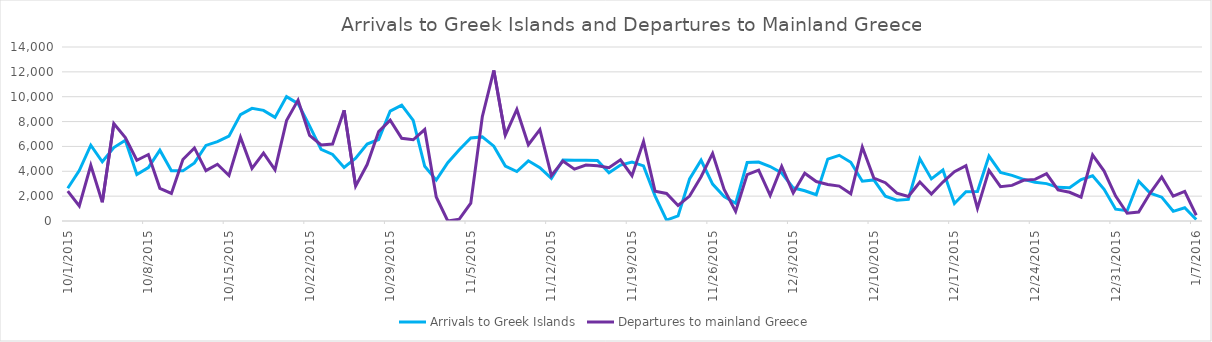
| Category | Arrivals to Greek Islands | Departures to mainland Greece |
|---|---|---|
| 10/1/15 | 2631 | 2409 |
| 10/2/15 | 4055 | 1215 |
| 10/3/15 | 6097 | 4480 |
| 10/4/15 | 4763 | 1513 |
| 10/5/15 | 5909 | 7833 |
| 10/6/15 | 6496 | 6707 |
| 10/7/15 | 3734 | 4886 |
| 10/8/15 | 4295 | 5349 |
| 10/9/15 | 5695 | 2631 |
| 10/10/15 | 4045 | 2214 |
| 10/11/15 | 4034 | 4950 |
| 10/12/15 | 4671 | 5879 |
| 10/13/15 | 6079 | 4052 |
| 10/14/15 | 6380 | 4564 |
| 10/15/15 | 6830 | 3660 |
| 10/16/15 | 8564 | 6743 |
| 10/17/15 | 9063 | 4239 |
| 10/18/15 | 8900 | 5457 |
| 10/19/15 | 8337 | 4119 |
| 10/20/15 | 10006 | 8083 |
| 10/21/15 | 9444 | 9725 |
| 10/22/15 | 7651 | 6896 |
| 10/23/15 | 5762 | 6120 |
| 10/24/15 | 5354 | 6195 |
| 10/25/15 | 4311 | 8916 |
| 10/26/15 | 5049 | 2804 |
| 10/27/15 | 6195 | 4540 |
| 10/28/15 | 6557 | 7191 |
| 10/29/15 | 8847 | 8117 |
| 10/30/15 | 9323 | 6649 |
| 10/31/15 | 8089 | 6537 |
| 11/1/15 | 4400 | 7360 |
| 11/2/15 | 3290 | 1935 |
| 11/3/15 | 4689 | 0 |
| 11/4/15 | 5740 | 142 |
| 11/5/15 | 6679 | 1430 |
| 11/6/15 | 6765 | 8392 |
| 11/7/15 | 6022 | 12116 |
| 11/8/15 | 4425 | 6902 |
| 11/9/15 | 3979 | 8977 |
| 11/10/15 | 4842 | 6133 |
| 11/11/15 | 4296 | 7354 |
| 11/12/15 | 3425 | 3650 |
| 11/13/15 | 4909 | 4820 |
| 11/14/15 | 4884 | 4171 |
| 11/15/15 | 4891 | 4497 |
| 11/16/15 | 4873 | 4442 |
| 11/17/15 | 3873 | 4289 |
| 11/18/15 | 4499 | 4927 |
| 11/19/15 | 4737 | 3644 |
| 11/20/15 | 4432 | 6389 |
| 11/21/15 | 2020 | 2401 |
| 11/22/15 | 76 | 2214 |
| 11/23/15 | 409 | 1245 |
| 11/24/15 | 3383 | 2006 |
| 11/25/15 | 4889 | 3565 |
| 11/26/15 | 2973 | 5435 |
| 11/27/15 | 1961 | 2532 |
| 11/28/15 | 1420 | 778 |
| 11/29/15 | 4703 | 3736 |
| 11/30/15 | 4744 | 4090 |
| 12/1/15 | 4386 | 2057 |
| 12/2/15 | 3863 | 4384 |
| 12/3/15 | 2671 | 2255 |
| 12/4/15 | 2435 | 3844 |
| 12/5/15 | 2110 | 3172 |
| 12/6/15 | 4978 | 2943 |
| 12/7/15 | 5287 | 2810 |
| 12/8/15 | 4721 | 2189 |
| 12/9/15 | 3203 | 5947 |
| 12/10/15 | 3308 | 3456 |
| 12/11/15 | 1999 | 3079 |
| 12/12/15 | 1671 | 2235 |
| 12/13/15 | 1738 | 1976 |
| 12/14/15 | 5005 | 3138 |
| 12/15/15 | 3389 | 2173 |
| 12/16/15 | 4098 | 3137 |
| 12/17/15 | 1402 | 3967 |
| 12/18/15 | 2354 | 4458 |
| 12/19/15 | 2373 | 1016 |
| 12/20/15 | 5223 | 4070 |
| 12/21/15 | 3904 | 2757 |
| 12/22/15 | 3668 | 2864 |
| 12/23/15 | 3354 | 3278 |
| 12/24/15 | 3110 | 3349 |
| 12/25/15 | 3008 | 3801 |
| 12/26/15 | 2710 | 2498 |
| 12/27/15 | 2678 | 2311 |
| 12/28/15 | 3337 | 1924 |
| 12/29/15 | 3643 | 5309 |
| 12/30/15 | 2552 | 4021 |
| 12/31/15 | 948 | 2009 |
| 1/1/16 | 828 | 623 |
| 1/2/16 | 3203 | 720 |
| 1/3/16 | 2241 | 2249 |
| 1/4/16 | 1917 | 3549 |
| 1/5/16 | 779 | 1998 |
| 1/6/16 | 1067 | 2377 |
| 1/7/16 | 119 | 463 |